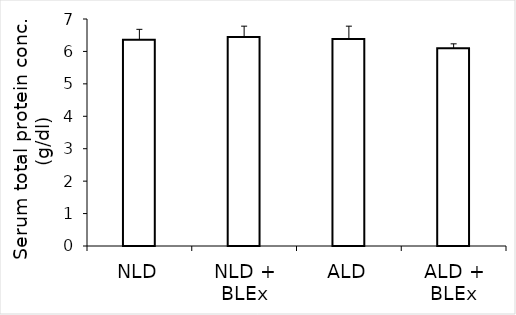
| Category | Series 0 |
|---|---|
| NLD | 6.36 |
| NLD + BLEx | 6.445 |
| ALD | 6.382 |
| ALD + BLEx | 6.101 |